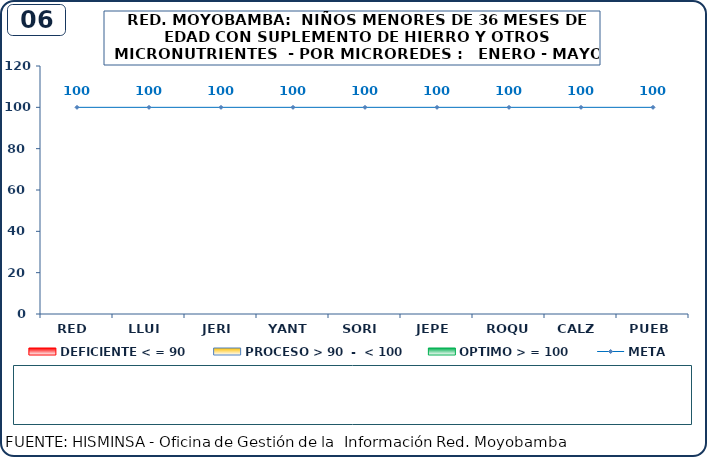
| Category | DEFICIENTE < = 90 | PROCESO > 90  -  < 100 | OPTIMO > = 100 |
|---|---|---|---|
| RED | 0 | 0 | 0 |
| LLUI | 0 | 0 | 0 |
| JERI | 0 | 0 | 0 |
| YANT | 0 | 0 | 0 |
| SORI | 0 | 0 | 0 |
| JEPE | 0 | 0 | 0 |
| ROQU | 0 | 0 | 0 |
| CALZ | 0 | 0 | 0 |
| PUEB | 0 | 0 | 0 |